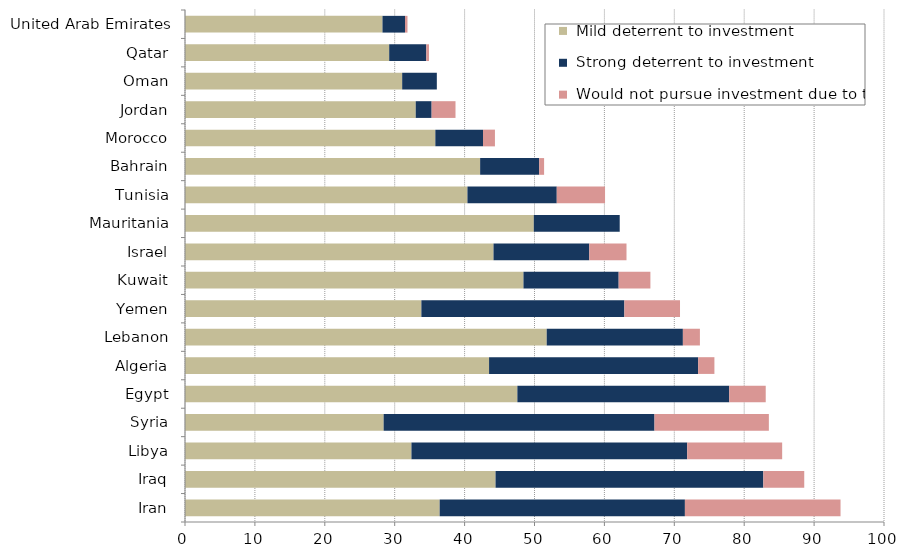
| Category |  Mild deterrent to investment |  Strong deterrent to investment |  Would not pursue investment due to this factor |
|---|---|---|---|
| Iran | 36.433 | 35.084 | 22.265 |
| Iraq | 44.428 | 38.309 | 5.853 |
| Libya | 32.396 | 39.45 | 13.585 |
| Syria | 28.417 | 38.75 | 16.361 |
| Egypt | 47.549 | 30.306 | 5.225 |
| Algeria | 43.501 | 29.907 | 2.33 |
| Lebanon | 51.747 | 19.481 | 2.435 |
| Yemen | 33.817 | 29.042 | 7.957 |
| Kuwait | 48.422 | 13.619 | 4.54 |
| Israel | 44.137 | 13.698 | 5.327 |
| Mauritania | 49.897 | 12.294 | 0 |
| Tunisia | 40.407 | 12.778 | 6.907 |
| Bahrain | 42.223 | 8.445 | 0.704 |
| Morocco | 35.814 | 6.822 | 1.705 |
| Jordan | 33.007 | 2.276 | 3.415 |
| Oman | 31.07 | 4.958 | 0 |
| Qatar | 29.213 | 5.311 | 0.379 |
| United Arab Emirates | 28.252 | 3.219 | 0.358 |